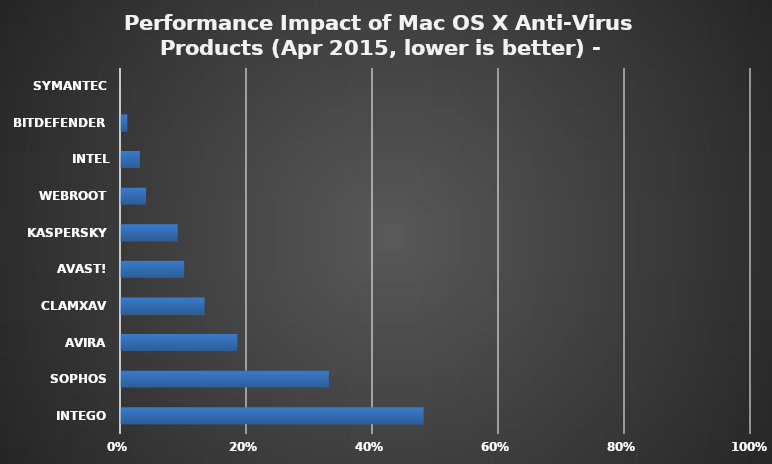
| Category | Series 0 |
|---|---|
| Intego | 0.48 |
| Sophos | 0.33 |
| Avira | 0.185 |
| ClamXav | 0.133 |
| avast! | 0.1 |
| Kaspersky | 0.09 |
| Webroot | 0.04 |
| Intel Security | 0.03 |
| Bitdefender | 0.01 |
| Symantec | 0 |